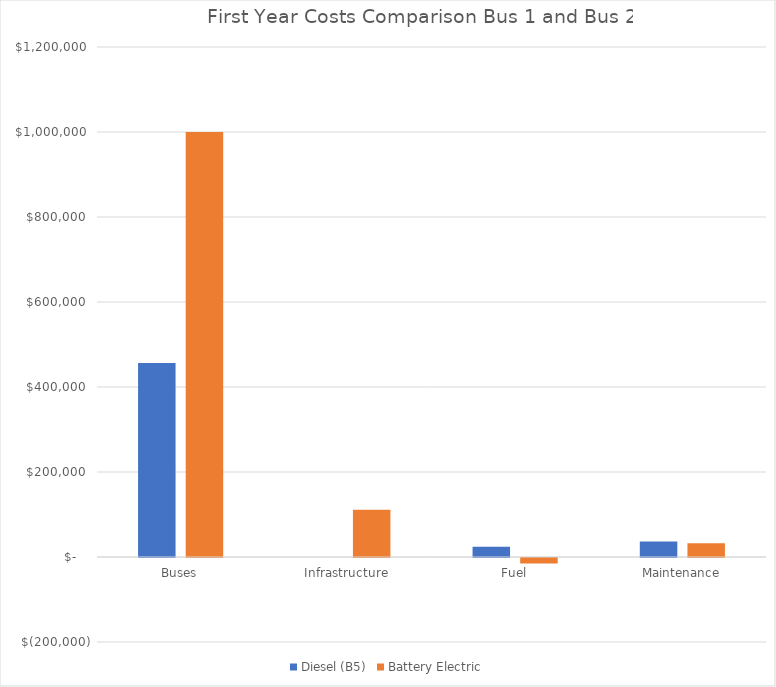
| Category | Diesel (B5) | Battery Electric |
|---|---|---|
| Buses | 456250 | 1000000 |
| Infrastructure | 0 | 111250 |
| Fuel | 24321.753 | -13032.28 |
| Maintenance | 36602.356 | 32324.688 |